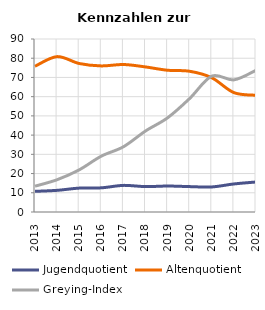
| Category | Jugendquotient | Altenquotient | Greying-Index |
|---|---|---|---|
| 2013.0 | 10.749 | 75.816 | 13.433 |
| 2014.0 | 11.265 | 80.83 | 16.794 |
| 2015.0 | 12.428 | 77.247 | 21.925 |
| 2016.0 | 12.571 | 76 | 29.06 |
| 2017.0 | 13.846 | 76.731 | 33.929 |
| 2018.0 | 13.208 | 75.472 | 42.138 |
| 2019.0 | 13.508 | 73.734 | 49 |
| 2020.0 | 13.21 | 73.21 | 59.06 |
| 2021.0 | 13.035 | 69.832 | 70.683 |
| 2022.0 | 14.59 | 62.1 | 68.75 |
| 2023.0 | 15.609 | 60.72 | 73.729 |